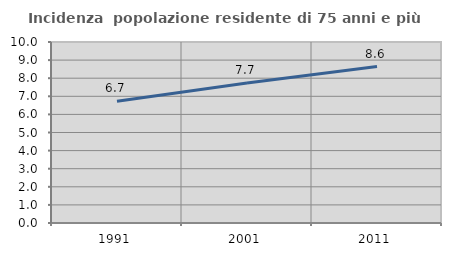
| Category | Incidenza  popolazione residente di 75 anni e più |
|---|---|
| 1991.0 | 6.724 |
| 2001.0 | 7.735 |
| 2011.0 | 8.642 |